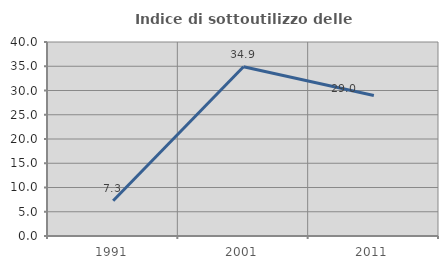
| Category | Indice di sottoutilizzo delle abitazioni  |
|---|---|
| 1991.0 | 7.253 |
| 2001.0 | 34.904 |
| 2011.0 | 28.966 |